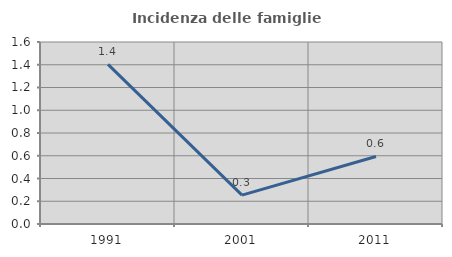
| Category | Incidenza delle famiglie numerose |
|---|---|
| 1991.0 | 1.404 |
| 2001.0 | 0.254 |
| 2011.0 | 0.593 |